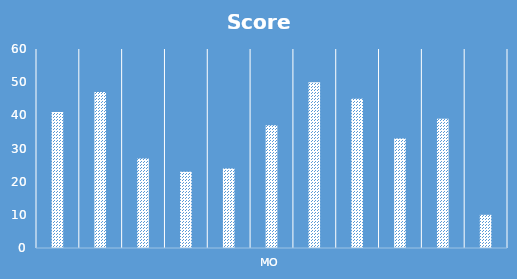
| Category | Score |
|---|---|
|  | 41 |
|  | 47 |
|  | 27 |
|  | 23 |
|  | 24 |
| Mo | 37 |